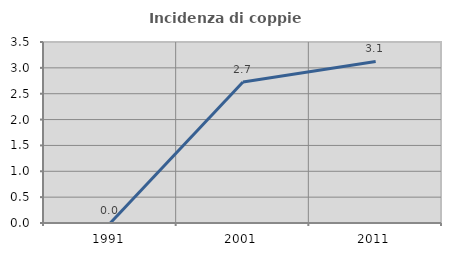
| Category | Incidenza di coppie miste |
|---|---|
| 1991.0 | 0 |
| 2001.0 | 2.727 |
| 2011.0 | 3.125 |